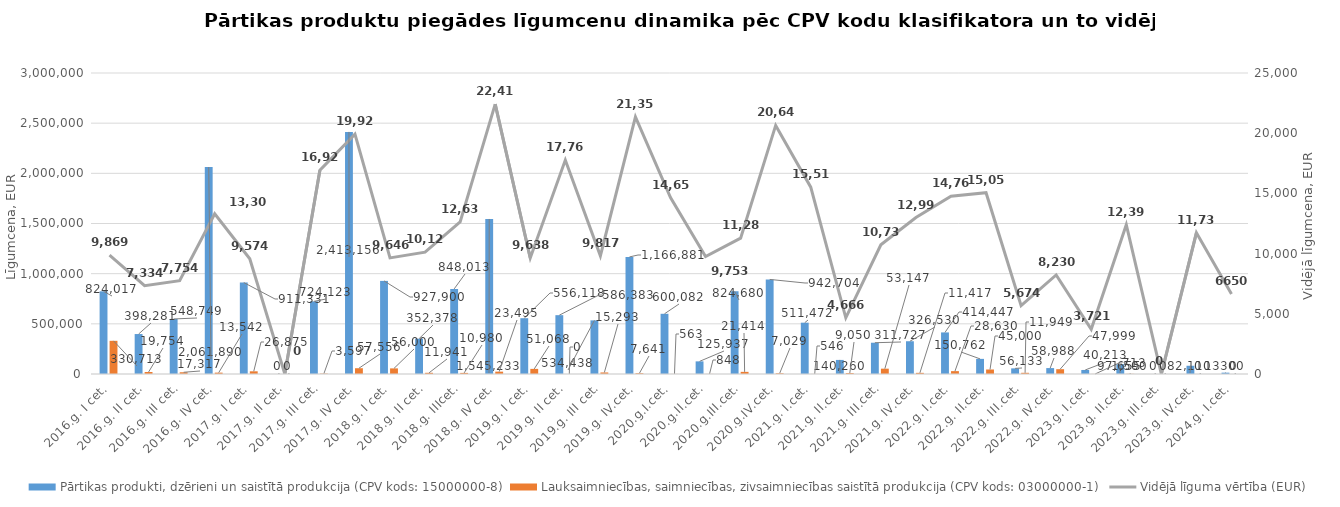
| Category | Pārtikas produkti, dzērieni un saistītā produkcija (CPV kods: 15000000-8) | Lauksaimniecības, saimniecības, zivsaimniecības saistītā produkcija (CPV kods: 03000000-1) |
|---|---|---|
| 2016.g. I cet. | 824017 | 330713 |
| 2016.g. II cet. | 398281 | 19754 |
| 2016.g. III cet. | 548749.01 | 17317 |
| 2016.g. IV cet. | 2061890 | 13542 |
| 2017.g. I cet. | 911330.81 | 26874.91 |
| 2017.g. II cet. | 0 | 0 |
| 2017.g. III cet. | 724123.07 | 3596.6 |
| 2017.g. IV cet. | 2413156 | 57556 |
| 2018.g. I cet. | 927900 | 56000 |
| 2018.g. II cet. | 352378 | 11941 |
| 2018.g. IIIcet. | 848013 | 10980 |
| 2018.g. IV cet. | 1545233 | 23495 |
| 2019.g. I cet. | 556118 | 51068 |
| 2019.g. II cet. | 586383 | 0 |
| 2019.g. III cet. | 534438 | 15293 |
| 2019.g. IV.cet. | 1166881 | 7641 |
| 2020.g.I.cet. | 600082 | 563 |
| 2020.g.II.cet. | 125937 | 848 |
| 2020.g.III.cet. | 824680 | 21414 |
| 2020.g.IV.cet. | 942704 | 7029 |
| 2021.g. I.cet. | 511472 | 546 |
| 2021.g. II.cet. | 140260 | 9050 |
| 2021.g. III.cet. | 311727 | 53147 |
| 2021.g. IV.cet. | 326530 | 11417 |
| 2022.g. I.cet. | 414447 | 28630 |
| 2022.g. II.cet. | 150762 | 45000 |
| 2022.g. III.cet. | 56133 | 11949 |
| 2022.g. IV.cet. | 58988 | 47999 |
| 2023.g. I.cet. | 40213 | 713 |
| 2023.g. II.cet. | 97655 | 1500 |
| 2023.g. III.cet. | 0 | 0 |
| 2023.g. IV.cet. | 82110 | 0 |
| 2024.g. I.cet. | 13300 | 0 |